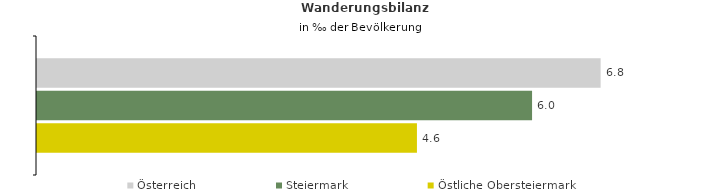
| Category | Österreich | Steiermark | Östliche Obersteiermark |
|---|---|---|---|
| Wanderungsrate in ‰ der Bevölkerung, Periode 2018-2022 | 6.822 | 5.992 | 4.598 |